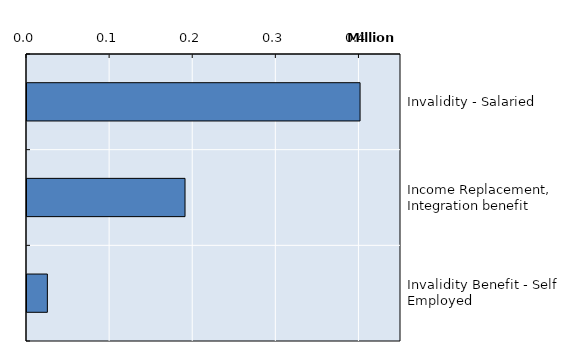
| Category | Series 0 |
|---|---|
| Invalidity - Salaried | 400745 |
| Income Replacement, Integration benefit | 190141 |
| Invalidity Benefit - Self Employed | 24497 |